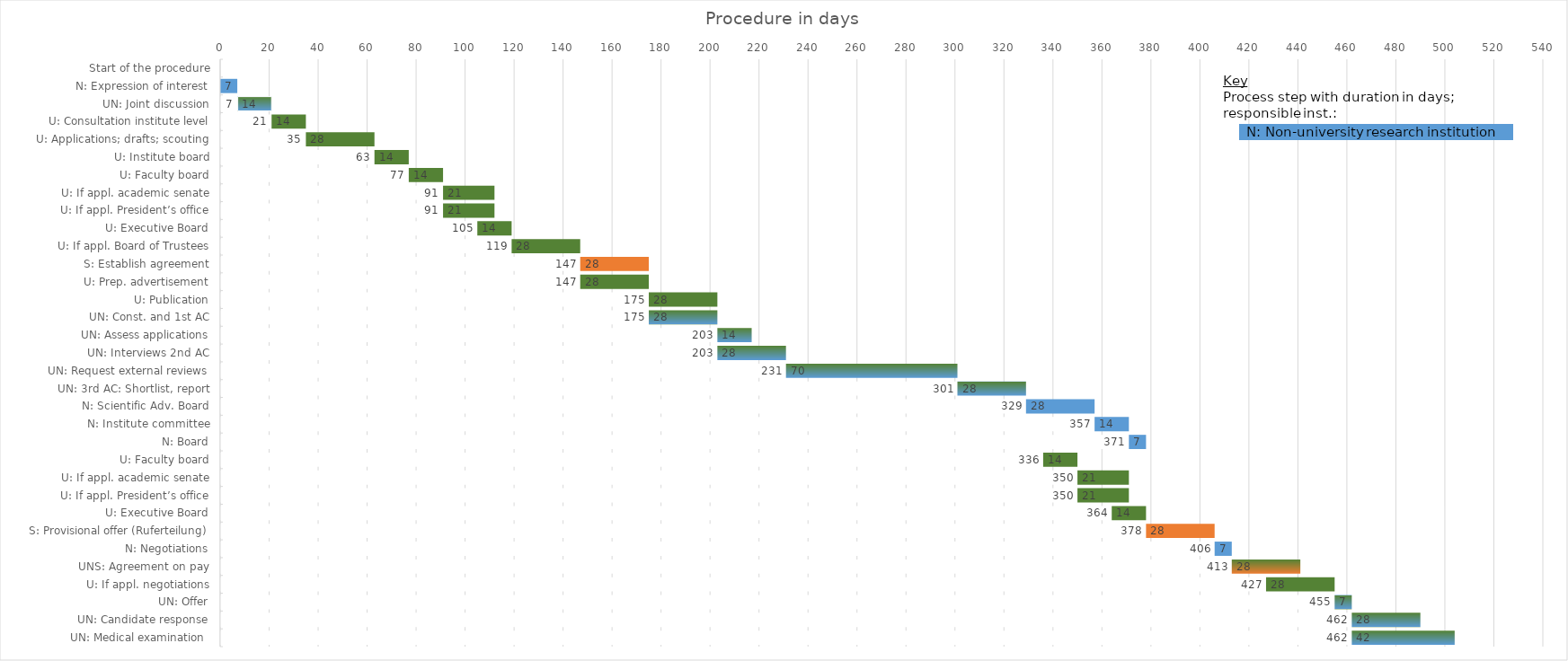
| Category | Total duration | Duration |
|---|---|---|
| Start of the procedure | 0 | 0 |
| N: Expression of interest | 0 | 7 |
| UN: Joint discussion | 7 | 14 |
| U: Consultation institute level | 21 | 14 |
| U: Applications; drafts; scouting | 35 | 28 |
| U: Institute board | 63 | 14 |
| U: Faculty board | 77 | 14 |
| U: If appl. academic senate | 91 | 21 |
| U: If appl. President’s office | 91 | 21 |
| U: Executive Board | 105 | 14 |
| U: If appl. Board of Trustees | 119 | 28 |
| S: Establish agreement | 147 | 28 |
| U: Prep. advertisement | 147 | 28 |
| U: Publication | 175 | 28 |
| UN: Const. and 1st AC | 175 | 28 |
| UN: Assess applications | 203 | 14 |
| UN: Interviews 2nd AC | 203 | 28 |
| UN: Request external reviews | 231 | 70 |
| UN: 3rd AC: Shortlist, report | 301 | 28 |
| N: Scientific Adv. Board | 329 | 28 |
| N: Institute committee | 357 | 14 |
| N: Board | 371 | 7 |
| U: Faculty board | 336 | 14 |
| U: If appl. academic senate | 350 | 21 |
| U: If appl. President’s office | 350 | 21 |
| U: Executive Board | 364 | 14 |
| S: Provisional offer (Ruferteilung) | 378 | 28 |
| N: Negotiations | 406 | 7 |
| UNS: Agreement on pay | 413 | 28 |
| U: If appl. negotiations | 427 | 28 |
| UN: Offer | 455 | 7 |
| UN: Candidate response | 462 | 28 |
| UN: Medical examination  | 462 | 42 |